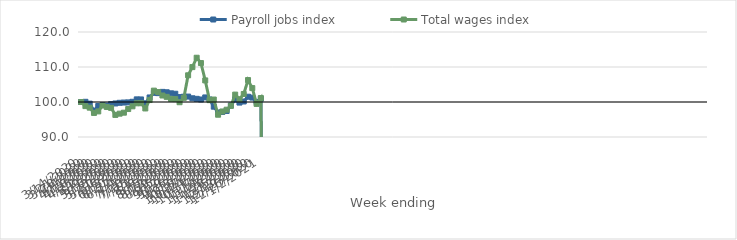
| Category | Payroll jobs index | Total wages index |
|---|---|---|
| 14/03/2020 | 100 | 100 |
| 21/03/2020 | 100.056 | 98.829 |
| 28/03/2020 | 99.528 | 98.382 |
| 04/04/2020 | 97.519 | 96.875 |
| 11/04/2020 | 98.861 | 97.311 |
| 18/04/2020 | 99.12 | 99.001 |
| 25/04/2020 | 98.977 | 98.565 |
| 02/05/2020 | 99.398 | 98.322 |
| 09/05/2020 | 99.582 | 96.312 |
| 16/05/2020 | 99.772 | 96.668 |
| 23/05/2020 | 99.845 | 96.947 |
| 30/05/2020 | 99.887 | 97.987 |
| 06/06/2020 | 100.06 | 98.764 |
| 13/06/2020 | 100.752 | 99.623 |
| 20/06/2020 | 100.732 | 99.65 |
| 27/06/2020 | 99.596 | 98.159 |
| 04/07/2020 | 101.299 | 100.562 |
| 11/07/2020 | 102.614 | 103.248 |
| 18/07/2020 | 102.535 | 102.843 |
| 25/07/2020 | 102.89 | 101.853 |
| 01/08/2020 | 102.781 | 101.467 |
| 08/08/2020 | 102.478 | 100.889 |
| 15/08/2020 | 102.353 | 100.834 |
| 22/08/2020 | 101.404 | 99.933 |
| 29/08/2020 | 101.513 | 101.195 |
| 05/09/2020 | 101.548 | 107.625 |
| 12/09/2020 | 101.065 | 109.971 |
| 19/09/2020 | 100.904 | 112.645 |
| 26/09/2020 | 100.717 | 111.127 |
| 03/10/2020 | 101.305 | 106.167 |
| 10/10/2020 | 100.724 | 100.532 |
| 17/10/2020 | 98.662 | 100.703 |
| 24/10/2020 | 97 | 96.364 |
| 31/10/2020 | 97.166 | 97.283 |
| 07/11/2020 | 97.438 | 97.8 |
| 14/11/2020 | 99.003 | 98.894 |
| 21/11/2020 | 100.715 | 102.111 |
| 28/11/2020 | 99.834 | 100.784 |
| 05/12/2020 | 100.147 | 102.293 |
| 12/12/2020 | 101.505 | 106.269 |
| 19/12/2020 | 101.258 | 103.969 |
| 26/12/2020 | 100.025 | 99.462 |
| 02/01/2021 | 100.947 | 101.127 |